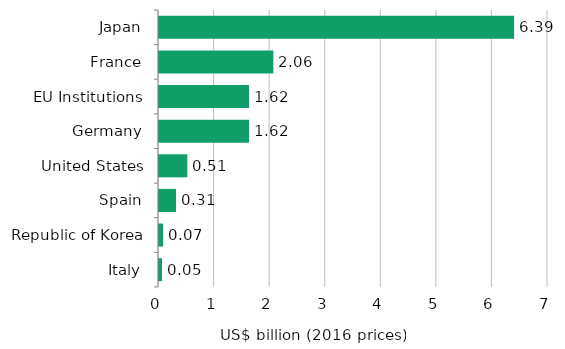
| Category | Series 0 |
|---|---|
| Italy | 54.587 |
| Republic of Korea | 73.973 |
| Spain | 306.718 |
| United States | 510.034 |
| Germany | 1620.309 |
| EU Institutions | 1620.546 |
| France | 2058.093 |
| Japan | 6390.985 |